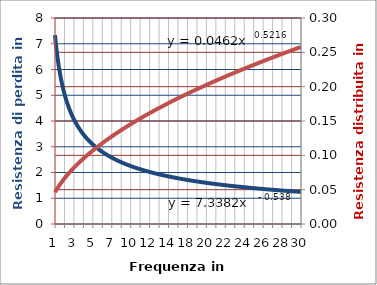
| Category | Resistenza di perdita |
|---|---|
| 1.0 | 7.176 |
| 2.0 | 5.018 |
| 3.0 | 4.077 |
| 4.0 | 3.521 |
| 5.0 | 3.143 |
| 6.0 | 2.865 |
| 7.0 | 2.649 |
| 8.0 | 2.476 |
| 10.0 | 2.212 |
| 11.0 | 2.108 |
| 12.0 | 2.017 |
| 13.0 | 1.937 |
| 14.0 | 1.866 |
| 15.0 | 1.802 |
| 18.0 | 1.644 |
| 19.0 | 1.599 |
| 20.0 | 1.558 |
| 21.0 | 1.521 |
| 22.0 | 1.485 |
| 23.0 | 1.452 |
| 24.0 | 1.422 |
| 25.0 | 1.393 |
| 26.0 | 1.365 |
| 27.0 | 1.34 |
| 28.0 | 1.315 |
| 29.0 | 1.292 |
| 30.0 | 1.271 |